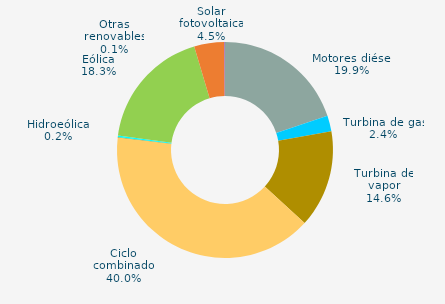
| Category | Series 0 |
|---|---|
| Motores diésel | 19.874 |
| Turbina de gas | 2.364 |
| Turbina de vapor | 14.578 |
| Ciclo combinado | 40.048 |
| Cogeneración | 0 |
| Hidráulica | 0.041 |
| Hidroeólica | 0.221 |
| Eólica | 18.273 |
| Solar fotovoltaica | 4.497 |
| Otras renovables | 0.104 |